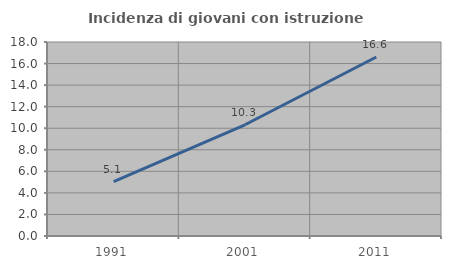
| Category | Incidenza di giovani con istruzione universitaria |
|---|---|
| 1991.0 | 5.056 |
| 2001.0 | 10.319 |
| 2011.0 | 16.61 |